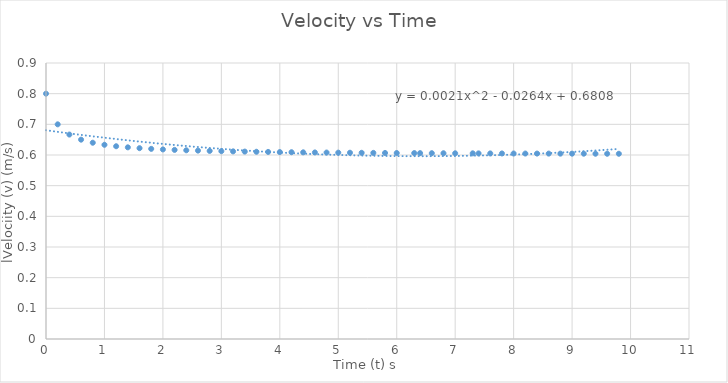
| Category | Velocity |
|---|---|
| 0.0 | 0.8 |
| 0.2 | 0.7 |
| 0.4 | 0.667 |
| 0.6 | 0.65 |
| 0.8 | 0.64 |
| 1.0 | 0.633 |
| 1.2 | 0.629 |
| 1.4 | 0.625 |
| 1.6 | 0.622 |
| 1.8 | 0.62 |
| 2.0 | 0.618 |
| 2.2 | 0.617 |
| 2.4 | 0.615 |
| 2.6 | 0.614 |
| 2.8 | 0.613 |
| 3.0 | 0.613 |
| 3.2 | 0.612 |
| 3.4 | 0.611 |
| 3.6 | 0.611 |
| 3.8 | 0.61 |
| 4.0 | 0.61 |
| 4.2 | 0.609 |
| 4.4 | 0.609 |
| 4.6 | 0.608 |
| 4.8 | 0.608 |
| 5.0 | 0.608 |
| 5.2 | 0.607 |
| 5.4 | 0.607 |
| 5.6 | 0.607 |
| 5.8 | 0.607 |
| 6.0 | 0.606 |
| 6.3 | 0.606 |
| 6.4 | 0.606 |
| 6.6 | 0.606 |
| 6.8 | 0.606 |
| 7.0 | 0.606 |
| 7.3 | 0.605 |
| 7.4 | 0.605 |
| 7.6 | 0.605 |
| 7.8 | 0.605 |
| 8.0 | 0.605 |
| 8.2 | 0.605 |
| 8.4 | 0.605 |
| 8.6 | 0.605 |
| 8.8 | 0.604 |
| 9.0 | 0.604 |
| 9.2 | 0.604 |
| 9.4 | 0.604 |
| 9.6 | 0.604 |
| 9.8 | 0.604 |